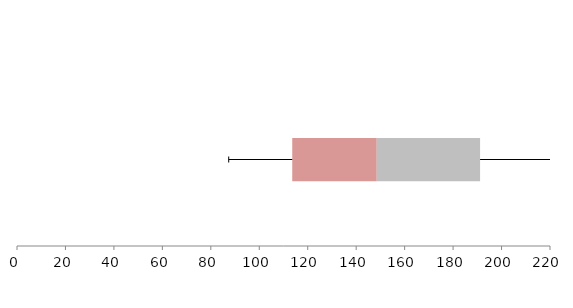
| Category | Series 1 | Series 2 | Series 3 |
|---|---|---|---|
| 0 | 113.61 | 34.883 | 42.642 |